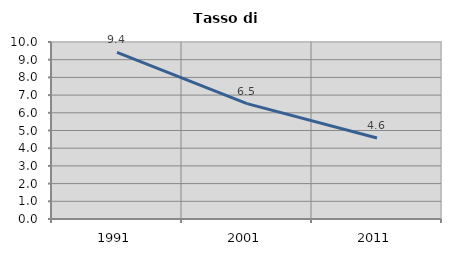
| Category | Tasso di disoccupazione   |
|---|---|
| 1991.0 | 9.418 |
| 2001.0 | 6.516 |
| 2011.0 | 4.574 |